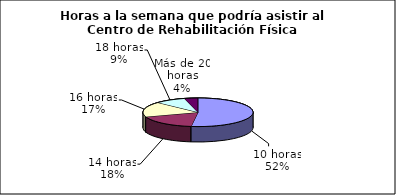
| Category | Series 0 |
|---|---|
| 10 horas | 0.52 |
| 14 horas | 0.18 |
| 16 horas | 0.17 |
| 18 horas | 0.09 |
| Más de 20 horas | 0.04 |